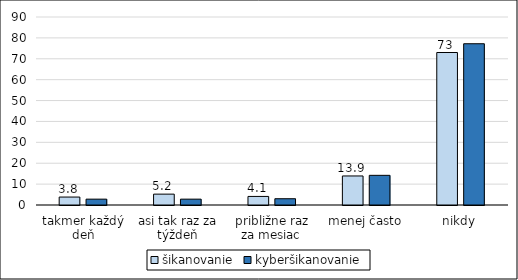
| Category | šikanovanie | kyberšikanovanie |
|---|---|---|
| takmer každý deň | 3.8 | 2.8 |
| asi tak raz za týždeň | 5.2 | 2.8 |
| približne raz za mesiac | 4.1 | 3 |
| menej často | 13.9 | 14.2 |
| nikdy | 73 | 77.2 |